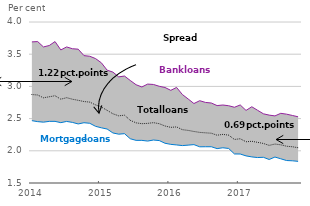
| Category | Mortgage loans | Banking loans | Loans in total |
|---|---|---|---|
| 2014-01-01 | 2.468 | 3.691 | 2.874 |
| 2014-02-01 | 2.453 | 3.696 | 2.866 |
| 2014-03-01 | 2.445 | 3.613 | 2.823 |
| 2014-04-01 | 2.457 | 3.635 | 2.839 |
| 2014-05-01 | 2.457 | 3.696 | 2.855 |
| 2014-06-01 | 2.437 | 3.566 | 2.801 |
| 2014-07-01 | 2.456 | 3.613 | 2.825 |
| 2014-08-01 | 2.441 | 3.585 | 2.801 |
| 2014-09-01 | 2.417 | 3.578 | 2.784 |
| 2014-10-01 | 2.436 | 3.478 | 2.765 |
| 2014-11-01 | 2.427 | 3.468 | 2.756 |
| 2014-12-01 | 2.38 | 3.432 | 2.713 |
| 2015-01-01 | 2.357 | 3.367 | 2.68 |
| 2015-02-01 | 2.338 | 3.252 | 2.628 |
| 2015-03-01 | 2.277 | 3.222 | 2.575 |
| 2015-04-01 | 2.258 | 3.148 | 2.543 |
| 2015-05-01 | 2.266 | 3.161 | 2.553 |
| 2015-06-01 | 2.187 | 3.092 | 2.473 |
| 2015-07-01 | 2.162 | 3.026 | 2.434 |
| 2015-08-01 | 2.162 | 2.991 | 2.421 |
| 2015-09-01 | 2.151 | 3.036 | 2.426 |
| 2015-10-01 | 2.167 | 3.03 | 2.437 |
| 2015-11-01 | 2.159 | 3.002 | 2.421 |
| 2015-12-01 | 2.117 | 2.983 | 2.385 |
| 2016-01-01 | 2.1 | 2.939 | 2.364 |
| 2016-02-01 | 2.091 | 2.984 | 2.371 |
| 2016-03-01 | 2.081 | 2.874 | 2.328 |
| 2016-04-01 | 2.088 | 2.805 | 2.317 |
| 2016-05-01 | 2.096 | 2.734 | 2.3 |
| 2016-06-01 | 2.062 | 2.778 | 2.286 |
| 2016-07-01 | 2.063 | 2.751 | 2.279 |
| 2016-08-01 | 2.063 | 2.742 | 2.273 |
| 2016-09-01 | 2.034 | 2.702 | 2.242 |
| 2016-10-01 | 2.047 | 2.711 | 2.255 |
| 2016-11-01 | 2.036 | 2.7 | 2.243 |
| 2016-12-01 | 1.951 | 2.676 | 2.176 |
| 2017-01-01 | 1.95 | 2.712 | 2.187 |
| 2017-02-01 | 1.921 | 2.627 | 2.14 |
| 2017-03-01 | 1.905 | 2.684 | 2.148 |
| 2017-04-01 | 1.895 | 2.629 | 2.131 |
| 2017-05-01 | 1.899 | 2.575 | 2.114 |
| 2017-06-01 | 1.865 | 2.554 | 2.084 |
| 2017-07-01 | 1.903 | 2.542 | 2.105 |
| 2017-08-01 | 1.876 | 2.582 | 2.093 |
| 2017-09-01 | 1.849 | 2.569 | 2.071 |
| 2017-10-01 | 1.845 | 2.549 | 2.063 |
| 2017-11-01 | 1.836 | 2.528 | 2.048 |